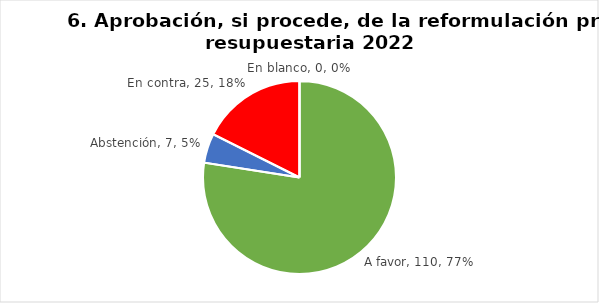
| Category | Series 0 |
|---|---|
| A favor | 110 |
| Abstención | 7 |
| En contra | 25 |
| En blanco | 0 |